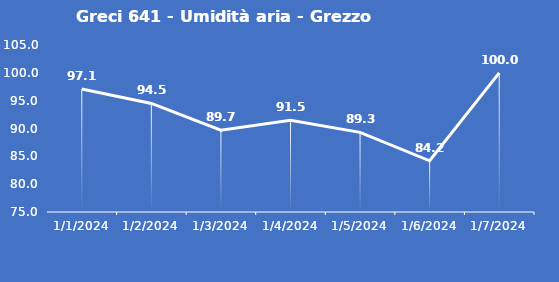
| Category | Greci 641 - Umidità aria - Grezzo (%) |
|---|---|
| 1/1/24 | 97.1 |
| 1/2/24 | 94.5 |
| 1/3/24 | 89.7 |
| 1/4/24 | 91.5 |
| 1/5/24 | 89.3 |
| 1/6/24 | 84.2 |
| 1/7/24 | 100 |